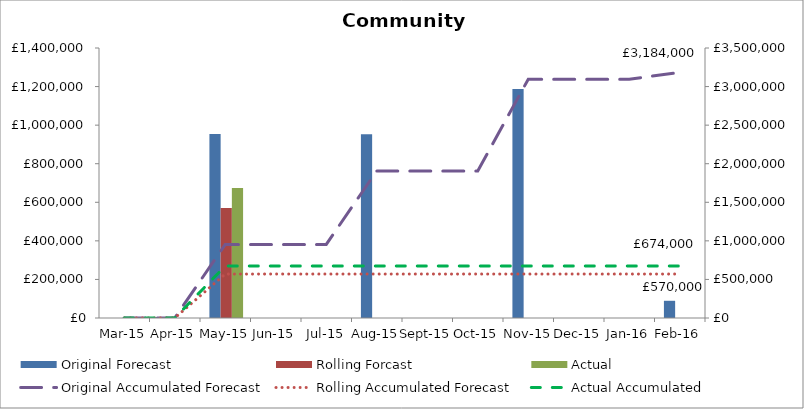
| Category | Original Forecast | Rolling Forcast | Actual |
|---|---|---|---|
| 2015-03-01 | 0 | 0 | 0 |
| 2015-04-01 | 0 | 0 | 0 |
| 2015-05-01 | 954083.34 | 570000 | 674000 |
| 2015-06-01 | 0 | 0 | 0 |
| 2015-07-01 | 0 | 0 | 0 |
| 2015-08-01 | 953083.34 | 0 | 0 |
| 2015-09-01 | 0 | 0 | 0 |
| 2015-10-01 | 0 | 0 | 0 |
| 2015-11-01 | 1187583.34 | 0 | 0 |
| 2015-12-01 | 0 | 0 | 0 |
| 2016-01-01 | 0 | 0 | 0 |
| 2016-02-01 | 89250 | 0 | 0 |